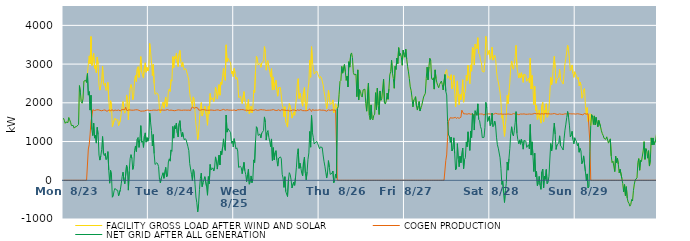
| Category | FACILITY GROSS LOAD AFTER WIND AND SOLAR | COGEN PRODUCTION | NET GRID AFTER ALL GENERATION |
|---|---|---|---|
|  Mon  8/23 | 1604 | 0 | 1604 |
|  Mon  8/23 | 1547 | 0 | 1547 |
|  Mon  8/23 | 1472 | 0 | 1472 |
|  Mon  8/23 | 1505 | 0 | 1505 |
|  Mon  8/23 | 1498 | 0 | 1498 |
|  Mon  8/23 | 1489 | 0 | 1489 |
|  Mon  8/23 | 1621 | 0 | 1621 |
|  Mon  8/23 | 1563 | 0 | 1563 |
|  Mon  8/23 | 1498 | 0 | 1498 |
|  Mon  8/23 | 1412 | 0 | 1412 |
|  Mon  8/23 | 1411 | 0 | 1411 |
|  Mon  8/23 | 1414 | 0 | 1414 |
|  Mon  8/23 | 1346 | 0 | 1346 |
|  Mon  8/23 | 1372 | 0 | 1372 |
|  Mon  8/23 | 1380 | 0 | 1380 |
|  Mon  8/23 | 1394 | 0 | 1394 |
|  Mon  8/23 | 1403 | 0 | 1403 |
|  Mon  8/23 | 1438 | 0 | 1438 |
|  Mon  8/23 | 2444 | 0 | 2444 |
|  Mon  8/23 | 2282 | 0 | 2282 |
|  Mon  8/23 | 2033 | 0 | 2033 |
|  Mon  8/23 | 1989 | 0 | 1989 |
|  Mon  8/23 | 2101 | 0 | 2101 |
|  Mon  8/23 | 2559 | 0 | 2559 |
|  Mon  8/23 | 2570 | 0 | 2570 |
|  Mon  8/23 | 2582 | 0 | 2582 |
|  Mon  8/23 | 2526 | 0 | 2526 |
|  Mon  8/23 | 2755 | 0 | 2755 |
|  Mon  8/23 | 3007 | 808 | 2199 |
|  Mon  8/23 | 3212 | 922 | 2290 |
|  Mon  8/23 | 3004 | 1192 | 1812 |
|  Mon  8/23 | 3711 | 1516 | 2195 |
|  Mon  8/23 | 2963 | 1656 | 1307 |
|  Mon  8/23 | 2975 | 1821 | 1154 |
|  Mon  8/23 | 3273 | 1800 | 1473 |
|  Mon  8/23 | 2890 | 1801 | 1089 |
|  Mon  8/23 | 2968 | 1811 | 1157 |
|  Mon  8/23 | 2777 | 1817 | 960 |
|  Mon  8/23 | 3183 | 1817 | 1366 |
|  Mon  8/23 | 3003 | 1821 | 1182 |
|  Mon  8/23 | 2454 | 1803 | 651 |
|  Mon  8/23 | 2328 | 1807 | 521 |
|  Mon  8/23 | 2450 | 1821 | 629 |
|  Mon  8/23 | 2584 | 1794 | 790 |
|  Mon  8/23 | 2946 | 1816 | 1130 |
|  Mon  8/23 | 2497 | 1810 | 687 |
|  Mon  8/23 | 2448 | 1812 | 636 |
|  Mon  8/23 | 2513 | 1818 | 695 |
|  Mon  8/23 | 2322 | 1787 | 535 |
|  Mon  8/23 | 2355 | 1787 | 568 |
|  Mon  8/23 | 2529 | 1788 | 741 |
|  Mon  8/23 | 2077 | 1818 | 259 |
|  Mon  8/23 | 1755 | 1831 | -76 |
|  Mon  8/23 | 2052 | 1798 | 254 |
|  Mon  8/23 | 1946 | 1805 | 141 |
|  Mon  8/23 | 1386 | 1823 | -437 |
|  Mon  8/23 | 1400 | 1789 | -389 |
|  Mon  8/23 | 1544 | 1814 | -270 |
|  Mon  8/23 | 1605 | 1815 | -210 |
|  Mon  8/23 | 1559 | 1803 | -244 |
|  Mon  8/23 | 1560 | 1802 | -242 |
|  Mon  8/23 | 1564 | 1824 | -260 |
|  Mon  8/23 | 1411 | 1815 | -404 |
|  Mon  8/23 | 1387 | 1816 | -429 |
|  Mon  8/23 | 1546 | 1788 | -242 |
|  Mon  8/23 | 1728 | 1819 | -91 |
|  Mon  8/23 | 1905 | 1813 | 92 |
|  Mon  8/23 | 2033 | 1825 | 208 |
|  Mon  8/23 | 1804 | 1805 | -1 |
|  Mon  8/23 | 1731 | 1822 | -91 |
|  Mon  8/23 | 1808 | 1886 | -78 |
|  Mon  8/23 | 2203 | 1815 | 388 |
|  Mon  8/23 | 2085 | 1788 | 297 |
|  Mon  8/23 | 1563 | 1818 | -255 |
|  Mon  8/23 | 2037 | 1806 | 231 |
|  Mon  8/23 | 2377 | 1814 | 563 |
|  Mon  8/23 | 2472 | 1811 | 661 |
|  Mon  8/23 | 2370 | 1809 | 561 |
|  Mon  8/23 | 2080 | 1800 | 280 |
|  Mon  8/23 | 2191 | 1810 | 381 |
|  Mon  8/23 | 2588 | 1813 | 775 |
|  Mon  8/23 | 2705 | 1819 | 886 |
|  Mon  8/23 | 2550 | 1808 | 742 |
|  Mon  8/23 | 2882 | 1820 | 1062 |
|  Mon  8/23 | 2933 | 1826 | 1107 |
|  Mon  8/23 | 2655 | 1806 | 849 |
|  Mon  8/23 | 2856 | 1799 | 1057 |
|  Mon  8/23 | 3194 | 1783 | 1411 |
|  Mon  8/23 | 2788 | 1806 | 982 |
|  Mon  8/23 | 2799 | 1787 | 1012 |
|  Mon  8/23 | 2639 | 1790 | 849 |
|  Mon  8/23 | 2926 | 1789 | 1137 |
|  Mon  8/23 | 3033 | 1809 | 1224 |
|  Mon  8/23 | 2791 | 1806 | 985 |
|  Mon  8/23 | 2915 | 1814 | 1101 |
|  Mon  8/23 | 2823 | 1814 | 1009 |
|  Tue  8/24 | 2908 | 1811 | 1097 |
|  Tue  8/24 | 3534 | 1802 | 1732 |
|  Tue  8/24 | 3310 | 1819 | 1491 |
|  Tue  8/24 | 3087 | 1803 | 1284 |
|  Tue  8/24 | 2704 | 1819 | 885 |
|  Tue  8/24 | 2992 | 1812 | 1180 |
|  Tue  8/24 | 2500 | 1811 | 689 |
|  Tue  8/24 | 2220 | 1812 | 408 |
|  Tue  8/24 | 2206 | 1807 | 399 |
|  Tue  8/24 | 2259 | 1806 | 453 |
|  Tue  8/24 | 2232 | 1812 | 420 |
|  Tue  8/24 | 2171 | 1817 | 354 |
|  Tue  8/24 | 1834 | 1815 | 19 |
|  Tue  8/24 | 1741 | 1809 | -68 |
|  Tue  8/24 | 1841 | 1790 | 51 |
|  Tue  8/24 | 1842 | 1814 | 28 |
|  Tue  8/24 | 2017 | 1823 | 194 |
|  Tue  8/24 | 1859 | 1809 | 50 |
|  Tue  8/24 | 1850 | 1812 | 38 |
|  Tue  8/24 | 2142 | 1812 | 330 |
|  Tue  8/24 | 1896 | 1810 | 86 |
|  Tue  8/24 | 1938 | 1826 | 112 |
|  Tue  8/24 | 2289 | 1815 | 474 |
|  Tue  8/24 | 2358 | 1805 | 553 |
|  Tue  8/24 | 2293 | 1800 | 493 |
|  Tue  8/24 | 2596 | 1812 | 784 |
|  Tue  8/24 | 2561 | 1814 | 747 |
|  Tue  8/24 | 3193 | 1803 | 1390 |
|  Tue  8/24 | 2905 | 1817 | 1088 |
|  Tue  8/24 | 3204 | 1796 | 1408 |
|  Tue  8/24 | 3143 | 1819 | 1324 |
|  Tue  8/24 | 3281 | 1806 | 1475 |
|  Tue  8/24 | 3053 | 1830 | 1223 |
|  Tue  8/24 | 2936 | 1818 | 1118 |
|  Tue  8/24 | 3267 | 1803 | 1464 |
|  Tue  8/24 | 3352 | 1812 | 1540 |
|  Tue  8/24 | 3071 | 1800 | 1271 |
|  Tue  8/24 | 2930 | 1806 | 1124 |
|  Tue  8/24 | 3055 | 1818 | 1237 |
|  Tue  8/24 | 2921 | 1811 | 1110 |
|  Tue  8/24 | 2845 | 1803 | 1042 |
|  Tue  8/24 | 2886 | 1812 | 1074 |
|  Tue  8/24 | 2854 | 1812 | 1042 |
|  Tue  8/24 | 2862 | 1809 | 1053 |
|  Tue  8/24 | 2678 | 1811 | 867 |
|  Tue  8/24 | 2575 | 1811 | 764 |
|  Tue  8/24 | 2246 | 1814 | 432 |
|  Tue  8/24 | 2091 | 1802 | 289 |
|  Tue  8/24 | 2021 | 1866 | 155 |
|  Tue  8/24 | 1880 | 1892 | -12 |
|  Tue  8/24 | 2153 | 1875 | 278 |
|  Tue  8/24 | 2091 | 1860 | 231 |
|  Tue  8/24 | 1760 | 1876 | -116 |
|  Tue  8/24 | 1447 | 1880 | -433 |
|  Tue  8/24 | 1302 | 1883 | -581 |
|  Tue  8/24 | 1051 | 1867 | -816 |
|  Tue  8/24 | 1214 | 1814 | -600 |
|  Tue  8/24 | 1570 | 1807 | -237 |
|  Tue  8/24 | 1858 | 1809 | 49 |
|  Tue  8/24 | 2006 | 1822 | 184 |
|  Tue  8/24 | 1659 | 1824 | -165 |
|  Tue  8/24 | 1741 | 1804 | -63 |
|  Tue  8/24 | 1832 | 1822 | 10 |
|  Tue  8/24 | 1915 | 1822 | 93 |
|  Tue  8/24 | 1922 | 1812 | 110 |
|  Tue  8/24 | 1646 | 1814 | -168 |
|  Tue  8/24 | 1421 | 1807 | -386 |
|  Tue  8/24 | 1914 | 1819 | 95 |
|  Tue  8/24 | 1718 | 1810 | -92 |
|  Tue  8/24 | 2238 | 1830 | 408 |
|  Tue  8/24 | 2083 | 1814 | 269 |
|  Tue  8/24 | 2099 | 1812 | 287 |
|  Tue  8/24 | 2130 | 1809 | 321 |
|  Tue  8/24 | 2030 | 1791 | 239 |
|  Tue  8/24 | 2139 | 1804 | 335 |
|  Tue  8/24 | 2406 | 1802 | 604 |
|  Tue  8/24 | 2290 | 1814 | 476 |
|  Tue  8/24 | 2096 | 1807 | 289 |
|  Tue  8/24 | 2121 | 1818 | 303 |
|  Tue  8/24 | 2469 | 1820 | 649 |
|  Tue  8/24 | 2196 | 1800 | 396 |
|  Tue  8/24 | 2536 | 1783 | 753 |
|  Tue  8/24 | 2477 | 1814 | 663 |
|  Tue  8/24 | 2675 | 1812 | 863 |
|  Tue  8/24 | 2899 | 1830 | 1069 |
|  Tue  8/24 | 2661 | 1812 | 849 |
|  Tue  8/24 | 2578 | 1808 | 770 |
|  Tue  8/24 | 3497 | 1812 | 1685 |
|  Tue  8/24 | 3064 | 1821 | 1243 |
|  Tue  8/24 | 3147 | 1815 | 1332 |
|  Tue  8/24 | 3131 | 1811 | 1320 |
|  Tue  8/24 | 3069 | 1804 | 1265 |
|  Tue  8/24 | 3040 | 1810 | 1230 |
|  Tue  8/24 | 2752 | 1796 | 956 |
|  Tue  8/24 | 2817 | 1807 | 1010 |
|  Tue  8/24 | 2675 | 1814 | 861 |
|  Wed  8/25 | 2890 | 1816 | 1074 |
|  Wed  8/25 | 2761 | 1812 | 949 |
|  Wed  8/25 | 2607 | 1798 | 809 |
|  Wed  8/25 | 2656 | 1818 | 838 |
|  Wed  8/25 | 2575 | 1821 | 754 |
|  Wed  8/25 | 2137 | 1805 | 332 |
|  Wed  8/25 | 2137 | 1821 | 316 |
|  Wed  8/25 | 2162 | 1804 | 358 |
|  Wed  8/25 | 2147 | 1825 | 322 |
|  Wed  8/25 | 1980 | 1810 | 170 |
|  Wed  8/25 | 1999 | 1824 | 175 |
|  Wed  8/25 | 2288 | 1826 | 462 |
|  Wed  8/25 | 2055 | 1810 | 245 |
|  Wed  8/25 | 1970 | 1818 | 152 |
|  Wed  8/25 | 1774 | 1810 | -36 |
|  Wed  8/25 | 1942 | 1800 | 142 |
|  Wed  8/25 | 2088 | 1804 | 284 |
|  Wed  8/25 | 1713 | 1815 | -102 |
|  Wed  8/25 | 1756 | 1813 | -57 |
|  Wed  8/25 | 1914 | 1802 | 112 |
|  Wed  8/25 | 1745 | 1808 | -63 |
|  Wed  8/25 | 1845 | 1806 | 39 |
|  Wed  8/25 | 2330 | 1804 | 526 |
|  Wed  8/25 | 2264 | 1805 | 459 |
|  Wed  8/25 | 2835 | 1824 | 1011 |
|  Wed  8/25 | 3200 | 1818 | 1382 |
|  Wed  8/25 | 3139 | 1806 | 1333 |
|  Wed  8/25 | 2974 | 1817 | 1157 |
|  Wed  8/25 | 2986 | 1812 | 1174 |
|  Wed  8/25 | 3022 | 1826 | 1196 |
|  Wed  8/25 | 2918 | 1824 | 1094 |
|  Wed  8/25 | 3028 | 1808 | 1220 |
|  Wed  8/25 | 3052 | 1818 | 1234 |
|  Wed  8/25 | 3084 | 1800 | 1284 |
|  Wed  8/25 | 3452 | 1816 | 1636 |
|  Wed  8/25 | 3313 | 1811 | 1502 |
|  Wed  8/25 | 2842 | 1804 | 1038 |
|  Wed  8/25 | 3039 | 1805 | 1234 |
|  Wed  8/25 | 3094 | 1809 | 1285 |
|  Wed  8/25 | 2926 | 1817 | 1109 |
|  Wed  8/25 | 2821 | 1809 | 1012 |
|  Wed  8/25 | 2665 | 1796 | 869 |
|  Wed  8/25 | 2881 | 1814 | 1067 |
|  Wed  8/25 | 2330 | 1820 | 510 |
|  Wed  8/25 | 2668 | 1825 | 843 |
|  Wed  8/25 | 2342 | 1814 | 528 |
|  Wed  8/25 | 2514 | 1807 | 707 |
|  Wed  8/25 | 2583 | 1818 | 765 |
|  Wed  8/25 | 2327 | 1801 | 526 |
|  Wed  8/25 | 2171 | 1806 | 365 |
|  Wed  8/25 | 2389 | 1821 | 568 |
|  Wed  8/25 | 2385 | 1807 | 578 |
|  Wed  8/25 | 2396 | 1793 | 603 |
|  Wed  8/25 | 2379 | 1821 | 558 |
|  Wed  8/25 | 1958 | 1805 | 153 |
|  Wed  8/25 | 1874 | 1816 | 58 |
|  Wed  8/25 | 1641 | 1826 | -185 |
|  Wed  8/25 | 1902 | 1810 | 92 |
|  Wed  8/25 | 1510 | 1802 | -292 |
|  Wed  8/25 | 1530 | 1803 | -273 |
|  Wed  8/25 | 1373 | 1794 | -421 |
|  Wed  8/25 | 1817 | 1813 | 4 |
|  Wed  8/25 | 1982 | 1786 | 196 |
|  Wed  8/25 | 1957 | 1810 | 147 |
|  Wed  8/25 | 1808 | 1797 | 11 |
|  Wed  8/25 | 1606 | 1804 | -198 |
|  Wed  8/25 | 1611 | 1817 | -206 |
|  Wed  8/25 | 1762 | 1807 | -45 |
|  Wed  8/25 | 1678 | 1811 | -133 |
|  Wed  8/25 | 1912 | 1830 | 82 |
|  Wed  8/25 | 2130 | 1792 | 338 |
|  Wed  8/25 | 2478 | 1821 | 657 |
|  Wed  8/25 | 2624 | 1810 | 814 |
|  Wed  8/25 | 2113 | 1806 | 307 |
|  Wed  8/25 | 2248 | 1808 | 440 |
|  Wed  8/25 | 2141 | 1823 | 318 |
|  Wed  8/25 | 2002 | 1821 | 181 |
|  Wed  8/25 | 1912 | 1798 | 114 |
|  Wed  8/25 | 2294 | 1814 | 480 |
|  Wed  8/25 | 2395 | 1797 | 598 |
|  Wed  8/25 | 1991 | 1800 | 191 |
|  Wed  8/25 | 1804 | 1794 | 10 |
|  Wed  8/25 | 2032 | 1813 | 219 |
|  Wed  8/25 | 2342 | 1805 | 537 |
|  Wed  8/25 | 2533 | 1826 | 707 |
|  Wed  8/25 | 3102 | 1842 | 1260 |
|  Wed  8/25 | 2659 | 1804 | 855 |
|  Wed  8/25 | 3449 | 1777 | 1672 |
|  Wed  8/25 | 3055 | 1826 | 1229 |
|  Wed  8/25 | 2905 | 1805 | 1100 |
|  Wed  8/25 | 2742 | 1806 | 936 |
|  Wed  8/25 | 2781 | 1809 | 972 |
|  Wed  8/25 | 2803 | 1812 | 991 |
|  Wed  8/25 | 2815 | 1815 | 1000 |
|  Wed  8/25 | 2751 | 1809 | 942 |
|  Wed  8/25 | 2751 | 1814 | 937 |
|  Thu  8/26 | 2631 | 1819 | 812 |
|  Thu  8/26 | 2680 | 1818 | 862 |
|  Thu  8/26 | 2654 | 1809 | 845 |
|  Thu  8/26 | 2659 | 1814 | 845 |
|  Thu  8/26 | 2465 | 1811 | 654 |
|  Thu  8/26 | 2300 | 1809 | 491 |
|  Thu  8/26 | 2167 | 1804 | 363 |
|  Thu  8/26 | 2037 | 1825 | 212 |
|  Thu  8/26 | 1840 | 1782 | 58 |
|  Thu  8/26 | 2015 | 1803 | 212 |
|  Thu  8/26 | 2325 | 1818 | 507 |
|  Thu  8/26 | 2143 | 1811 | 332 |
|  Thu  8/26 | 1956 | 1804 | 152 |
|  Thu  8/26 | 1945 | 1795 | 150 |
|  Thu  8/26 | 1999 | 1818 | 181 |
|  Thu  8/26 | 2075 | 1836 | 239 |
|  Thu  8/26 | 1747 | 1809 | -62 |
|  Thu  8/26 | 1821 | 1812 | 9 |
|  Thu  8/26 | 1974 | 1814 | 160 |
|  Thu  8/26 | 1851 | 1795 | 56 |
|  Thu  8/26 | 1848 | 0 | 1848 |
|  Thu  8/26 | 1898 | 0 | 1898 |
|  Thu  8/26 | 2221 | 0 | 2221 |
|  Thu  8/26 | 2551 | 0 | 2551 |
|  Thu  8/26 | 2578 | 0 | 2578 |
|  Thu  8/26 | 2938 | 0 | 2938 |
|  Thu  8/26 | 2766 | 0 | 2766 |
|  Thu  8/26 | 2791 | 0 | 2791 |
|  Thu  8/26 | 2986 | 0 | 2986 |
|  Thu  8/26 | 2803 | 0 | 2803 |
|  Thu  8/26 | 2580 | 0 | 2580 |
|  Thu  8/26 | 2690 | 0 | 2690 |
|  Thu  8/26 | 2410 | 0 | 2410 |
|  Thu  8/26 | 3062 | 0 | 3062 |
|  Thu  8/26 | 2922 | 0 | 2922 |
|  Thu  8/26 | 3243 | 0 | 3243 |
|  Thu  8/26 | 3288 | 0 | 3288 |
|  Thu  8/26 | 3166 | 0 | 3166 |
|  Thu  8/26 | 2784 | 0 | 2784 |
|  Thu  8/26 | 2723 | 0 | 2723 |
|  Thu  8/26 | 2727 | 0 | 2727 |
|  Thu  8/26 | 2737 | 0 | 2737 |
|  Thu  8/26 | 2158 | 0 | 2158 |
|  Thu  8/26 | 2851 | 0 | 2851 |
|  Thu  8/26 | 2072 | 0 | 2072 |
|  Thu  8/26 | 2343 | 0 | 2343 |
|  Thu  8/26 | 2297 | 0 | 2297 |
|  Thu  8/26 | 2181 | 0 | 2181 |
|  Thu  8/26 | 2149 | 0 | 2149 |
|  Thu  8/26 | 2334 | 0 | 2334 |
|  Thu  8/26 | 2317 | 0 | 2317 |
|  Thu  8/26 | 2352 | 0 | 2352 |
|  Thu  8/26 | 1982 | 0 | 1982 |
|  Thu  8/26 | 1784 | 0 | 1784 |
|  Thu  8/26 | 1768 | 0 | 1768 |
|  Thu  8/26 | 2509 | 0 | 2509 |
|  Thu  8/26 | 1677 | 0 | 1677 |
|  Thu  8/26 | 1565 | 0 | 1565 |
|  Thu  8/26 | 1946 | 0 | 1946 |
|  Thu  8/26 | 1592 | 0 | 1592 |
|  Thu  8/26 | 1559 | 0 | 1559 |
|  Thu  8/26 | 1673 | 0 | 1673 |
|  Thu  8/26 | 1705 | 0 | 1705 |
|  Thu  8/26 | 2261 | 0 | 2261 |
|  Thu  8/26 | 1825 | 0 | 1825 |
|  Thu  8/26 | 2377 | 0 | 2377 |
|  Thu  8/26 | 1937 | 0 | 1937 |
|  Thu  8/26 | 1698 | 0 | 1698 |
|  Thu  8/26 | 2306 | 0 | 2306 |
|  Thu  8/26 | 2064 | 0 | 2064 |
|  Thu  8/26 | 2111 | 0 | 2111 |
|  Thu  8/26 | 2121 | 0 | 2121 |
|  Thu  8/26 | 2614 | 0 | 2614 |
|  Thu  8/26 | 2008 | 0 | 2008 |
|  Thu  8/26 | 1968 | 0 | 1968 |
|  Thu  8/26 | 2050 | 0 | 2050 |
|  Thu  8/26 | 2251 | 0 | 2251 |
|  Thu  8/26 | 2092 | 0 | 2092 |
|  Thu  8/26 | 2356 | 0 | 2356 |
|  Thu  8/26 | 2720 | 0 | 2720 |
|  Thu  8/26 | 2806 | 0 | 2806 |
|  Thu  8/26 | 3099 | 0 | 3099 |
|  Thu  8/26 | 2765 | 0 | 2765 |
|  Thu  8/26 | 2629 | 0 | 2629 |
|  Thu  8/26 | 2376 | 0 | 2376 |
|  Thu  8/26 | 2941 | 0 | 2941 |
|  Thu  8/26 | 2861 | 0 | 2861 |
|  Thu  8/26 | 3156 | 0 | 3156 |
|  Thu  8/26 | 3016 | 0 | 3016 |
|  Thu  8/26 | 3424 | 0 | 3424 |
|  Thu  8/26 | 3217 | 0 | 3217 |
|  Thu  8/26 | 3273 | 0 | 3273 |
|  Thu  8/26 | 3181 | 0 | 3181 |
|  Thu  8/26 | 2970 | 0 | 2970 |
|  Thu  8/26 | 3358 | 0 | 3358 |
|  Thu  8/26 | 3254 | 0 | 3254 |
|  Fri  8/27 | 3178 | 0 | 3178 |
|  Fri  8/27 | 3381 | 0 | 3381 |
|  Fri  8/27 | 3134 | 0 | 3134 |
|  Fri  8/27 | 2944 | 0 | 2944 |
|  Fri  8/27 | 2798 | 0 | 2798 |
|  Fri  8/27 | 2623 | 0 | 2623 |
|  Fri  8/27 | 2411 | 0 | 2411 |
|  Fri  8/27 | 2317 | 0 | 2317 |
|  Fri  8/27 | 2130 | 0 | 2130 |
|  Fri  8/27 | 1895 | 0 | 1895 |
|  Fri  8/27 | 2069 | 0 | 2069 |
|  Fri  8/27 | 2107 | 0 | 2107 |
|  Fri  8/27 | 2158 | 0 | 2158 |
|  Fri  8/27 | 1919 | 0 | 1919 |
|  Fri  8/27 | 1813 | 0 | 1813 |
|  Fri  8/27 | 1919 | 0 | 1919 |
|  Fri  8/27 | 2034 | 0 | 2034 |
|  Fri  8/27 | 1788 | 0 | 1788 |
|  Fri  8/27 | 1873 | 0 | 1873 |
|  Fri  8/27 | 1938 | 0 | 1938 |
|  Fri  8/27 | 1924 | 0 | 1924 |
|  Fri  8/27 | 2150 | 0 | 2150 |
|  Fri  8/27 | 2166 | 0 | 2166 |
|  Fri  8/27 | 2247 | 0 | 2247 |
|  Fri  8/27 | 2627 | 0 | 2627 |
|  Fri  8/27 | 2921 | 0 | 2921 |
|  Fri  8/27 | 2593 | 0 | 2593 |
|  Fri  8/27 | 2926 | 0 | 2926 |
|  Fri  8/27 | 3148 | 0 | 3148 |
|  Fri  8/27 | 3088 | 0 | 3088 |
|  Fri  8/27 | 2624 | 0 | 2624 |
|  Fri  8/27 | 2595 | 0 | 2595 |
|  Fri  8/27 | 2645 | 0 | 2645 |
|  Fri  8/27 | 2354 | 0 | 2354 |
|  Fri  8/27 | 2851 | 0 | 2851 |
|  Fri  8/27 | 2623 | 0 | 2623 |
|  Fri  8/27 | 2515 | 0 | 2515 |
|  Fri  8/27 | 2443 | 0 | 2443 |
|  Fri  8/27 | 2390 | 0 | 2390 |
|  Fri  8/27 | 2475 | 0 | 2475 |
|  Fri  8/27 | 2490 | 0 | 2490 |
|  Fri  8/27 | 2561 | 0 | 2561 |
|  Fri  8/27 | 2476 | 0 | 2476 |
|  Fri  8/27 | 2333 | 0 | 2333 |
|  Fri  8/27 | 2327 | 0 | 2327 |
|  Fri  8/27 | 2729 | 0 | 2729 |
|  Fri  8/27 | 2806 | 512 | 2294 |
|  Fri  8/27 | 2857 | 654 | 2203 |
|  Fri  8/27 | 2633 | 1112 | 1521 |
|  Fri  8/27 | 2689 | 1520 | 1169 |
|  Fri  8/27 | 2659 | 1516 | 1143 |
|  Fri  8/27 | 2594 | 1616 | 978 |
|  Fri  8/27 | 2725 | 1609 | 1116 |
|  Fri  8/27 | 2363 | 1606 | 757 |
|  Fri  8/27 | 2443 | 1624 | 819 |
|  Fri  8/27 | 2708 | 1612 | 1096 |
|  Fri  8/27 | 2312 | 1623 | 689 |
|  Fri  8/27 | 1896 | 1626 | 270 |
|  Fri  8/27 | 1908 | 1592 | 316 |
|  Fri  8/27 | 2566 | 1619 | 947 |
|  Fri  8/27 | 2157 | 1603 | 554 |
|  Fri  8/27 | 1949 | 1600 | 349 |
|  Fri  8/27 | 2217 | 1596 | 621 |
|  Fri  8/27 | 2079 | 1628 | 451 |
|  Fri  8/27 | 2242 | 1810 | 432 |
|  Fri  8/27 | 2597 | 1766 | 831 |
|  Fri  8/27 | 2016 | 1716 | 300 |
|  Fri  8/27 | 2247 | 1714 | 533 |
|  Fri  8/27 | 2297 | 1715 | 582 |
|  Fri  8/27 | 2708 | 1716 | 992 |
|  Fri  8/27 | 2572 | 1707 | 865 |
|  Fri  8/27 | 2966 | 1715 | 1251 |
|  Fri  8/27 | 2704 | 1721 | 983 |
|  Fri  8/27 | 2491 | 1721 | 770 |
|  Fri  8/27 | 2979 | 1706 | 1273 |
|  Fri  8/27 | 2816 | 1711 | 1105 |
|  Fri  8/27 | 3436 | 1714 | 1722 |
|  Fri  8/27 | 3394 | 1707 | 1687 |
|  Fri  8/27 | 2975 | 1678 | 1297 |
|  Fri  8/27 | 3514 | 1719 | 1795 |
|  Fri  8/27 | 3454 | 1710 | 1744 |
|  Fri  8/27 | 3391 | 1715 | 1676 |
|  Fri  8/27 | 3681 | 1708 | 1973 |
|  Fri  8/27 | 3278 | 1708 | 1570 |
|  Fri  8/27 | 3247 | 1710 | 1537 |
|  Fri  8/27 | 3097 | 1712 | 1385 |
|  Fri  8/27 | 3037 | 1718 | 1319 |
|  Fri  8/27 | 2814 | 1711 | 1103 |
|  Fri  8/27 | 2809 | 1707 | 1102 |
|  Fri  8/27 | 2794 | 1684 | 1110 |
|  Fri  8/27 | 3082 | 1715 | 1367 |
|  Fri  8/27 | 3718 | 1706 | 2012 |
|  Fri  8/27 | 3580 | 1709 | 1871 |
|  Fri  8/27 | 3233 | 1714 | 1519 |
|  Fri  8/27 | 3253 | 1715 | 1538 |
|  Fri  8/27 | 3362 | 1708 | 1654 |
|  Sat  8/28 | 3124 | 1712 | 1412 |
|  Sat  8/28 | 3190 | 1713 | 1477 |
|  Sat  8/28 | 3437 | 1701 | 1736 |
|  Sat  8/28 | 3102 | 1717 | 1385 |
|  Sat  8/28 | 3118 | 1707 | 1411 |
|  Sat  8/28 | 3230 | 1703 | 1527 |
|  Sat  8/28 | 3140 | 1729 | 1411 |
|  Sat  8/28 | 2818 | 1704 | 1114 |
|  Sat  8/28 | 2631 | 1714 | 917 |
|  Sat  8/28 | 2545 | 1715 | 830 |
|  Sat  8/28 | 2542 | 1709 | 833 |
|  Sat  8/28 | 2274 | 1694 | 580 |
|  Sat  8/28 | 2017 | 1714 | 303 |
|  Sat  8/28 | 1604 | 1710 | -106 |
|  Sat  8/28 | 1682 | 1705 | -23 |
|  Sat  8/28 | 1366 | 1708 | -342 |
|  Sat  8/28 | 1134 | 1707 | -573 |
|  Sat  8/28 | 1436 | 1705 | -269 |
|  Sat  8/28 | 1628 | 1706 | -78 |
|  Sat  8/28 | 2192 | 1720 | 472 |
|  Sat  8/28 | 1974 | 1713 | 261 |
|  Sat  8/28 | 2264 | 1709 | 555 |
|  Sat  8/28 | 2529 | 1706 | 823 |
|  Sat  8/28 | 2918 | 1718 | 1200 |
|  Sat  8/28 | 3081 | 1700 | 1381 |
|  Sat  8/28 | 2915 | 1720 | 1195 |
|  Sat  8/28 | 2865 | 1721 | 1144 |
|  Sat  8/28 | 2992 | 1714 | 1278 |
|  Sat  8/28 | 3195 | 1712 | 1483 |
|  Sat  8/28 | 3483 | 1711 | 1772 |
|  Sat  8/28 | 2920 | 1709 | 1211 |
|  Sat  8/28 | 2770 | 1724 | 1046 |
|  Sat  8/28 | 2640 | 1695 | 945 |
|  Sat  8/28 | 2760 | 1718 | 1042 |
|  Sat  8/28 | 2641 | 1711 | 930 |
|  Sat  8/28 | 2776 | 1715 | 1061 |
|  Sat  8/28 | 2666 | 1709 | 957 |
|  Sat  8/28 | 2528 | 1725 | 803 |
|  Sat  8/28 | 2739 | 1714 | 1025 |
|  Sat  8/28 | 2749 | 1713 | 1036 |
|  Sat  8/28 | 2716 | 1704 | 1012 |
|  Sat  8/28 | 2556 | 1707 | 849 |
|  Sat  8/28 | 2591 | 1706 | 885 |
|  Sat  8/28 | 2636 | 1718 | 918 |
|  Sat  8/28 | 2520 | 1712 | 808 |
|  Sat  8/28 | 3156 | 1716 | 1440 |
|  Sat  8/28 | 2356 | 1705 | 651 |
|  Sat  8/28 | 2706 | 1713 | 993 |
|  Sat  8/28 | 2351 | 1712 | 639 |
|  Sat  8/28 | 1953 | 1727 | 226 |
|  Sat  8/28 | 2427 | 1727 | 700 |
|  Sat  8/28 | 1805 | 1713 | 92 |
|  Sat  8/28 | 1940 | 1715 | 225 |
|  Sat  8/28 | 1572 | 1713 | -141 |
|  Sat  8/28 | 1662 | 1718 | -56 |
|  Sat  8/28 | 1813 | 1713 | 100 |
|  Sat  8/28 | 1580 | 1707 | -127 |
|  Sat  8/28 | 1474 | 1708 | -234 |
|  Sat  8/28 | 1935 | 1718 | 217 |
|  Sat  8/28 | 2014 | 1724 | 290 |
|  Sat  8/28 | 1512 | 1709 | -197 |
|  Sat  8/28 | 1813 | 1704 | 109 |
|  Sat  8/28 | 1746 | 1721 | 25 |
|  Sat  8/28 | 1975 | 1697 | 278 |
|  Sat  8/28 | 1626 | 1716 | -90 |
|  Sat  8/28 | 1657 | 1708 | -51 |
|  Sat  8/28 | 1821 | 1716 | 105 |
|  Sat  8/28 | 2262 | 1713 | 549 |
|  Sat  8/28 | 2659 | 1710 | 949 |
|  Sat  8/28 | 2466 | 1709 | 757 |
|  Sat  8/28 | 2632 | 1714 | 918 |
|  Sat  8/28 | 2983 | 1711 | 1272 |
|  Sat  8/28 | 3201 | 1724 | 1477 |
|  Sat  8/28 | 2898 | 1711 | 1187 |
|  Sat  8/28 | 2505 | 1708 | 797 |
|  Sat  8/28 | 2620 | 1704 | 916 |
|  Sat  8/28 | 2637 | 1700 | 937 |
|  Sat  8/28 | 2663 | 1705 | 958 |
|  Sat  8/28 | 2862 | 1714 | 1148 |
|  Sat  8/28 | 2602 | 1710 | 892 |
|  Sat  8/28 | 2569 | 1704 | 865 |
|  Sat  8/28 | 2556 | 1710 | 846 |
|  Sat  8/28 | 2484 | 1703 | 781 |
|  Sat  8/28 | 2754 | 1682 | 1072 |
|  Sat  8/28 | 3010 | 1716 | 1294 |
|  Sat  8/28 | 3147 | 1697 | 1450 |
|  Sat  8/28 | 3334 | 1713 | 1621 |
|  Sat  8/28 | 3484 | 1708 | 1776 |
|  Sat  8/28 | 3349 | 1718 | 1631 |
|  Sat  8/28 | 3140 | 1716 | 1424 |
|  Sat  8/28 | 2834 | 1717 | 1117 |
|  Sat  8/28 | 2885 | 1713 | 1172 |
|  Sat  8/28 | 2977 | 1713 | 1264 |
|  Sat  8/28 | 2767 | 1716 | 1051 |
|  Sat  8/28 | 2657 | 1715 | 942 |
|  Sat  8/28 | 2805 | 1707 | 1098 |
|  Sun  8/29 | 2823 | 1708 | 1115 |
|  Sun  8/29 | 2697 | 1707 | 990 |
|  Sun  8/29 | 2609 | 1718 | 891 |
|  Sun  8/29 | 2658 | 1706 | 952 |
|  Sun  8/29 | 2435 | 1711 | 724 |
|  Sun  8/29 | 2533 | 1709 | 824 |
|  Sun  8/29 | 2456 | 1701 | 755 |
|  Sun  8/29 | 2119 | 1692 | 427 |
|  Sun  8/29 | 2187 | 1690 | 497 |
|  Sun  8/29 | 2336 | 1706 | 630 |
|  Sun  8/29 | 2370 | 1724 | 646 |
|  Sun  8/29 | 1933 | 1712 | 221 |
|  Sun  8/29 | 1696 | 1708 | -12 |
|  Sun  8/29 | 1875 | 1711 | 164 |
|  Sun  8/29 | 1518 | 1716 | -198 |
|  Sun  8/29 | 1549 | 1711 | -162 |
|  Sun  8/29 | 1721 | 987 | 734 |
|  Sun  8/29 | 1418 | 0 | 1418 |
|  Sun  8/29 | 1695 | 0 | 1695 |
|  Sun  8/29 | 1631 | 0 | 1631 |
|  Sun  8/29 | 1441 | 0 | 1441 |
|  Sun  8/29 | 1662 | 0 | 1662 |
|  Sun  8/29 | 1430 | 0 | 1430 |
|  Sun  8/29 | 1625 | 0 | 1625 |
|  Sun  8/29 | 1637 | 0 | 1637 |
|  Sun  8/29 | 1384 | 0 | 1384 |
|  Sun  8/29 | 1547 | 0 | 1547 |
|  Sun  8/29 | 1544 | 0 | 1544 |
|  Sun  8/29 | 1383 | 0 | 1383 |
|  Sun  8/29 | 1277 | 0 | 1277 |
|  Sun  8/29 | 1204 | 0 | 1204 |
|  Sun  8/29 | 1155 | 0 | 1155 |
|  Sun  8/29 | 1082 | 0 | 1082 |
|  Sun  8/29 | 1099 | 0 | 1099 |
|  Sun  8/29 | 1057 | 0 | 1057 |
|  Sun  8/29 | 1122 | 0 | 1122 |
|  Sun  8/29 | 1123 | 0 | 1123 |
|  Sun  8/29 | 959 | 0 | 959 |
|  Sun  8/29 | 982 | 0 | 982 |
|  Sun  8/29 | 1069 | 0 | 1069 |
|  Sun  8/29 | 629 | 0 | 629 |
|  Sun  8/29 | 456 | 0 | 456 |
|  Sun  8/29 | 493 | 0 | 493 |
|  Sun  8/29 | 507 | 0 | 507 |
|  Sun  8/29 | 225 | 0 | 225 |
|  Sun  8/29 | 622 | 0 | 622 |
|  Sun  8/29 | 457 | 0 | 457 |
|  Sun  8/29 | 570 | 0 | 570 |
|  Sun  8/29 | 413 | 0 | 413 |
|  Sun  8/29 | 194 | 0 | 194 |
|  Sun  8/29 | 284 | 0 | 284 |
|  Sun  8/29 | 296 | 0 | 296 |
|  Sun  8/29 | 43 | 0 | 43 |
|  Sun  8/29 | -87 | 0 | -87 |
|  Sun  8/29 | -297 | 0 | -297 |
|  Sun  8/29 | -111 | 0 | -111 |
|  Sun  8/29 | -396 | 0 | -396 |
|  Sun  8/29 | -166 | 0 | -166 |
|  Sun  8/29 | -457 | 0 | -457 |
|  Sun  8/29 | -560 | 0 | -560 |
|  Sun  8/29 | -596 | 0 | -596 |
|  Sun  8/29 | -668 | 0 | -668 |
|  Sun  8/29 | -624 | 0 | -624 |
|  Sun  8/29 | -496 | 0 | -496 |
|  Sun  8/29 | -535 | 0 | -535 |
|  Sun  8/29 | -268 | 0 | -268 |
|  Sun  8/29 | -99 | 0 | -99 |
|  Sun  8/29 | 8 | 0 | 8 |
|  Sun  8/29 | 14 | 0 | 14 |
|  Sun  8/29 | 62 | 0 | 62 |
|  Sun  8/29 | 459 | 0 | 459 |
|  Sun  8/29 | 559 | 0 | 559 |
|  Sun  8/29 | 260 | 0 | 260 |
|  Sun  8/29 | 511 | 0 | 511 |
|  Sun  8/29 | 483 | 0 | 483 |
|  Sun  8/29 | 465 | 0 | 465 |
|  Sun  8/29 | 757 | 0 | 757 |
|  Sun  8/29 | 995 | 0 | 995 |
|  Sun  8/29 | 540 | 0 | 540 |
|  Sun  8/29 | 817 | 0 | 817 |
|  Sun  8/29 | 751 | 0 | 751 |
|  Sun  8/29 | 571 | 0 | 571 |
|  Sun  8/29 | 763 | 0 | 763 |
|  Sun  8/29 | 367 | 0 | 367 |
|  Sun  8/29 | 521 | 0 | 521 |
|  Sun  8/29 | 1094 | 0 | 1094 |
|  Sun  8/29 | 911 | 0 | 911 |
|  Sun  8/29 | 1093 | 0 | 1093 |
|  Sun  8/29 | 916 | 0 | 916 |
|  Sun  8/29 | 921 | 0 | 921 |
|  Sun  8/29 | 1036 | 0 | 1036 |
|  Sun  8/29 | 1204 | 0 | 1204 |